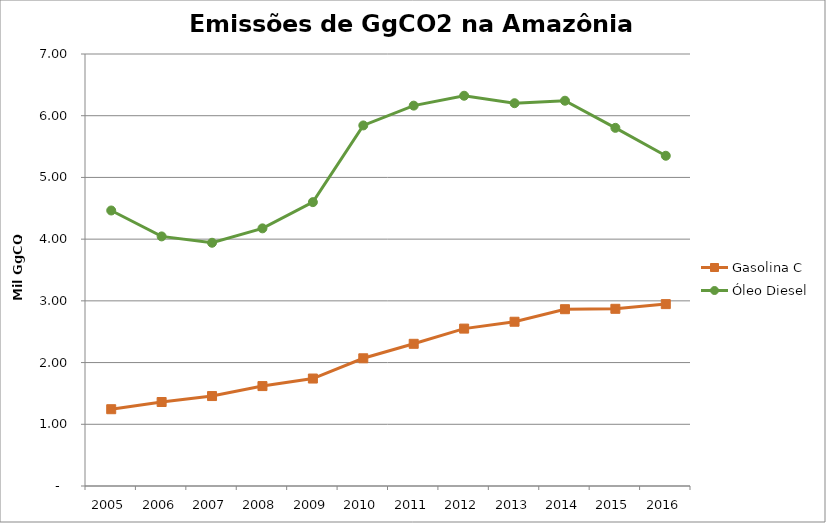
| Category | Gasolina C | Óleo Diesel |
|---|---|---|
| 2005.0 | 1244.358 | 4464.13 |
| 2006.0 | 1360.937 | 4044.195 |
| 2007.0 | 1457.541 | 3941.515 |
| 2008.0 | 1618.978 | 4174.772 |
| 2009.0 | 1741.288 | 4599.496 |
| 2010.0 | 2069.308 | 5842.531 |
| 2011.0 | 2304.201 | 6163.363 |
| 2012.0 | 2550.375 | 6323.658 |
| 2013.0 | 2661.66 | 6202.671 |
| 2014.0 | 2864.845 | 6242.737 |
| 2015.0 | 2871.346 | 5803.469 |
| 2016.0 | 2947.21 | 5351.134 |